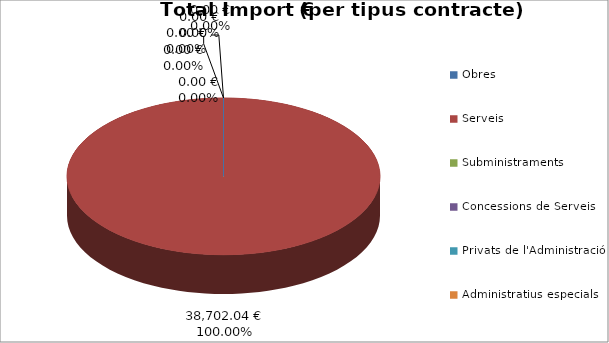
| Category | Total preu              (amb iva) |
|---|---|
| Obres | 0 |
| Serveis | 38702.04 |
| Subministraments | 0 |
| Concessions de Serveis | 0 |
| Privats de l'Administració | 0 |
| Administratius especials | 0 |